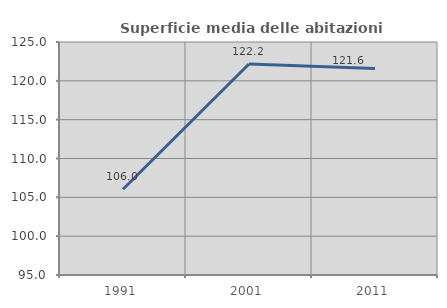
| Category | Superficie media delle abitazioni occupate |
|---|---|
| 1991.0 | 106.042 |
| 2001.0 | 122.175 |
| 2011.0 | 121.576 |